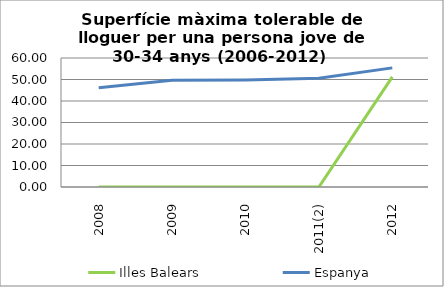
| Category | Illes Balears | Espanya |
|---|---|---|
| 2008 | 0 | 46.2 |
| 2009 | 0 | 49.7 |
| 2010 | 0 | 49.8 |
| 2011(2) | 0 | 50.533 |
| 2012 | 51.2 | 55.4 |